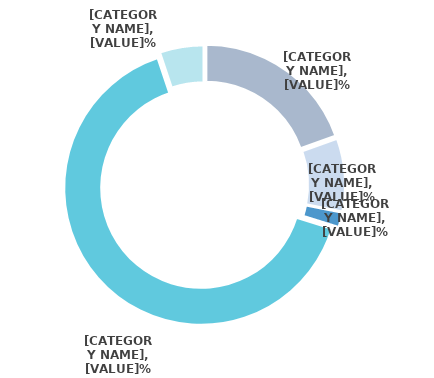
| Category | Series 0 |
|---|---|
| Africa | 19.56 |
| Americas | 8.564 |
| Arab States | 1.706 |
| Asia and the Pacific | 65.02 |
| Europe and Central Asia | 5.149 |